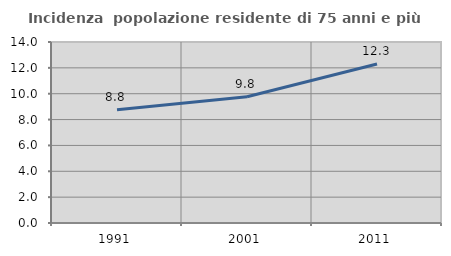
| Category | Incidenza  popolazione residente di 75 anni e più |
|---|---|
| 1991.0 | 8.751 |
| 2001.0 | 9.766 |
| 2011.0 | 12.301 |